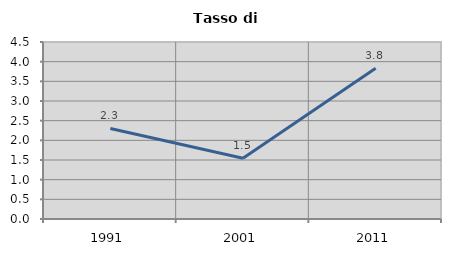
| Category | Tasso di disoccupazione   |
|---|---|
| 1991.0 | 2.301 |
| 2001.0 | 1.545 |
| 2011.0 | 3.83 |